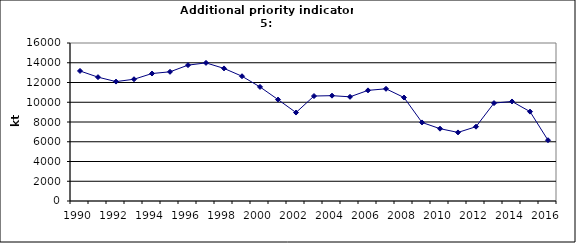
| Category | Production of oxygen steel, kt |
|---|---|
| 1990 | 13169 |
| 1991 | 12540 |
| 1992 | 12091 |
| 1993 | 12330 |
| 1994 | 12909 |
| 1995 | 13083 |
| 1996 | 13759 |
| 1997 | 13987 |
| 1998 | 13426 |
| 1999 | 12633 |
| 2000 | 11551 |
| 2001 | 10271 |
| 2002 | 8956 |
| 2003 | 10630 |
| 2004 | 10667 |
| 2005 | 10549.7 |
| 2006 | 11202.6 |
| 2007 | 11361.9 |
| 2008 | 10478 |
| 2009 | 7955 |
| 2010 | 7322.9 |
| 2011 | 6946.2 |
| 2012 | 7525.1 |
| 2013 | 9915.1 |
| 2014 | 10078.6 |
| 2015 | 9050.8 |
| 2016 | 6152.7 |